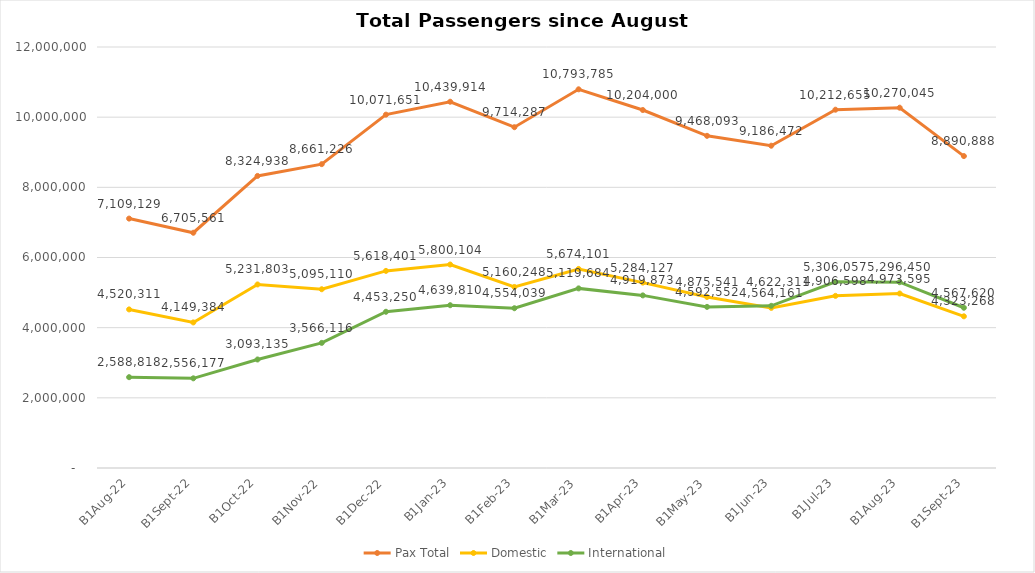
| Category | Pax Total |  Domestic  |  International  |
|---|---|---|---|
| 2022-08-01 | 7109129 | 4520311 | 2588818 |
| 2022-09-01 | 6705561 | 4149384 | 2556177 |
| 2022-10-01 | 8324938 | 5231803 | 3093135 |
| 2022-11-01 | 8661226 | 5095110 | 3566116 |
| 2022-12-01 | 10071651 | 5618401 | 4453250 |
| 2023-01-01 | 10439914 | 5800104 | 4639810 |
| 2023-02-01 | 9714287 | 5160248 | 4554039 |
| 2023-03-01 | 10793785 | 5674101 | 5119684 |
| 2023-04-01 | 10204000 | 5284127 | 4919873 |
| 2023-05-01 | 9468093 | 4875541 | 4592552 |
| 2023-06-01 | 9186472 | 4564161 | 4622311 |
| 2023-07-01 | 10212655 | 4906598 | 5306057 |
| 2023-08-01 | 10270045 | 4973595 | 5296450 |
| 2023-09-01 | 8890888 | 4323268 | 4567620 |